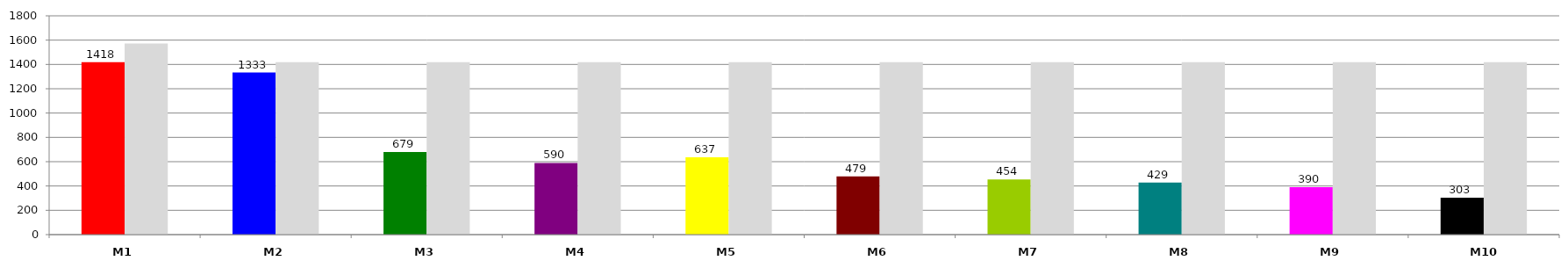
| Category | Series 0 | Series 1 |
|---|---|---|
| M1 | 1418 | 1572 |
| M2 | 1333 | 1418 |
| M3 | 679 | 1418 |
| M4 | 590 | 1418 |
| M5 | 637 | 1418 |
| M6 | 479 | 1418 |
| M7 | 454 | 1418 |
| M8 | 429 | 1418 |
| M9 | 390 | 1418 |
| M10 | 303 | 1418 |